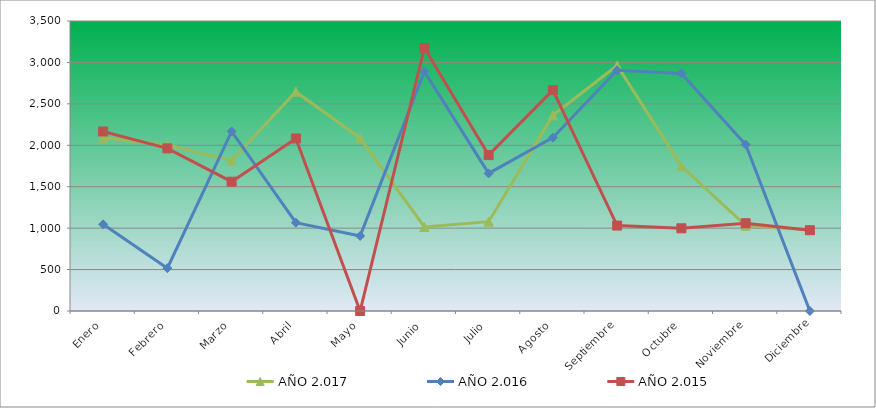
| Category | AÑO 2.017 | AÑO 2.016 | AÑO 2.015 |
|---|---|---|---|
| Enero | 2090.323 | 1045.997 | 2166.609 |
| Febrero | 2004.281 | 516.728 | 1962.933 |
| Marzo | 1817.012 | 2167.246 | 1560.672 |
| Abril | 2647.068 | 1066.064 | 2082.593 |
| Mayo | 2087.793 | 905.528 | 0 |
| Junio | 1014.794 | 2889.661 | 3174.808 |
| Julio | 1078.06 | 1660.552 | 1881.462 |
| Agosto | 2361.104 | 2091.994 | 2665.617 |
| Septiembre | 2963.4 | 2904.712 | 1031.113 |
| Octubre | 1748.685 | 2867.086 | 998.015 |
| Noviembre | 1029.978 | 2009.218 | 1059.118 |
| Diciembre | 976.834 | 0 | 975.101 |